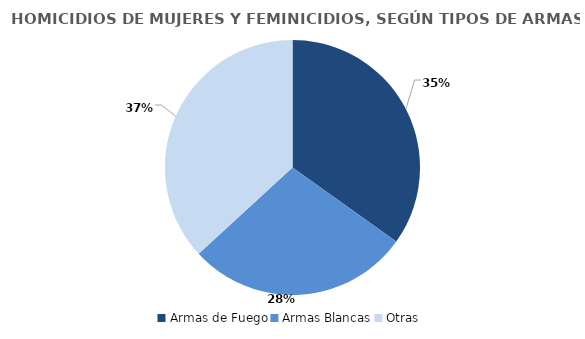
| Category | Series 0 |
|---|---|
| Armas de Fuego | 53 |
| Armas Blancas | 43 |
| Otras | 56 |